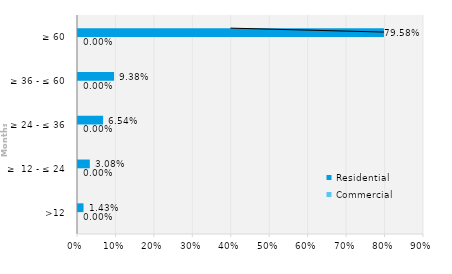
| Category | Commercial | Residential |
|---|---|---|
| >12 | 0 | 0.014 |
| ≥  12 - ≤ 24 | 0 | 0.031 |
| ≥ 24 - ≤ 36 | 0 | 0.065 |
| ≥ 36 - ≤ 60 | 0 | 0.094 |
| ≥ 60 | 0 | 0.796 |